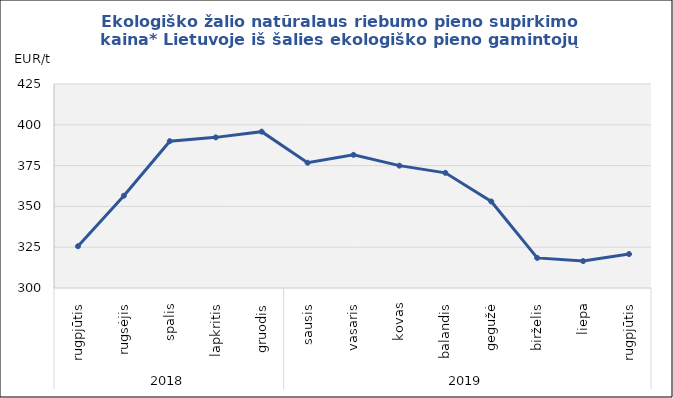
| Category | Ekologiško žalio natūralaus riebumo pieno supirkimo kaina* Lietuvoje iš šalies ekologiško pieno gamintojų |
|---|---|
| 0 | 325.59 |
| 1 | 356.54 |
| 2 | 389.97 |
| 3 | 392.3 |
| 4 | 395.81 |
| 5 | 376.75 |
| 6 | 381.6 |
| 7 | 374.97 |
| 8 | 370.57 |
| 9 | 353.02 |
| 10 | 318.43 |
| 11 | 316.5 |
| 12 | 320.81 |